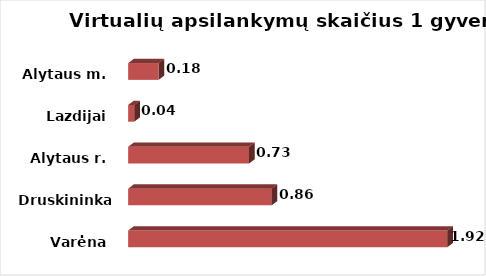
| Category | Series 0 |
|---|---|
| Varėna | 1.919 |
| Druskininkai  | 0.862 |
| Alytaus r. | 0.727 |
| Lazdijai | 0.037 |
| Alytaus m. | 0.183 |